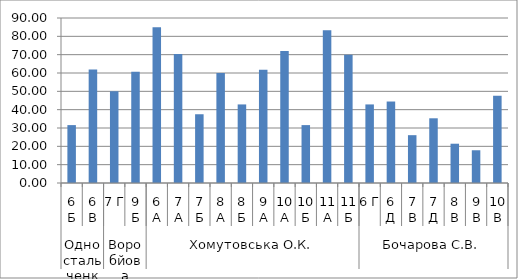
| Category | Series 0 |
|---|---|
| 0 | 31.579 |
| 1 | 61.905 |
| 2 | 50 |
| 3 | 60.714 |
| 4 | 85 |
| 5 | 70.37 |
| 6 | 37.5 |
| 7 | 60 |
| 8 | 42.857 |
| 9 | 61.765 |
| 10 | 72 |
| 11 | 31.579 |
| 12 | 83.333 |
| 13 | 70 |
| 14 | 42.857 |
| 15 | 44.444 |
| 16 | 26.087 |
| 17 | 35.294 |
| 18 | 21.429 |
| 19 | 17.857 |
| 20 | 47.619 |